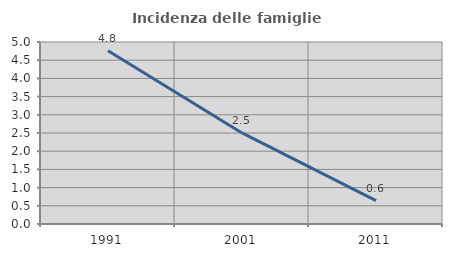
| Category | Incidenza delle famiglie numerose |
|---|---|
| 1991.0 | 4.758 |
| 2001.0 | 2.502 |
| 2011.0 | 0.645 |